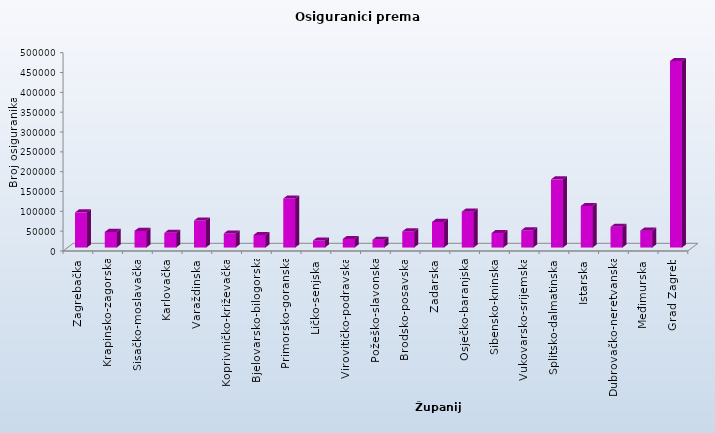
| Category | Series 0 |
|---|---|
| Zagrebačka | 88680 |
| Krapinsko-zagorska | 39396 |
| Sisačko-moslavačka | 42006 |
| Karlovačka | 37015 |
| Varaždinska | 68122 |
| Koprivničko-križevačka | 35483 |
| Bjelovarsko-bilogorska | 31590 |
| Primorsko-goranska | 123683 |
| Ličko-senjska | 17696 |
| Virovitičko-podravska | 21643 |
| Požeško-slavonska | 19737 |
| Brodsko-posavska | 40625 |
| Zadarska | 64602 |
| Osječko-baranjska | 90441 |
| Šibensko-kninska | 36560 |
| Vukovarsko-srijemska | 43581 |
| Splitsko-dalmatinska | 171890 |
| Istarska | 104702 |
| Dubrovačko-neretvanska | 52188 |
| Međimurska | 42641 |
| Grad Zagreb | 470270 |